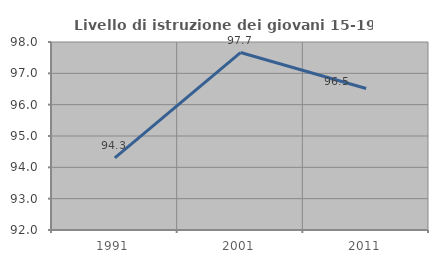
| Category | Livello di istruzione dei giovani 15-19 anni |
|---|---|
| 1991.0 | 94.302 |
| 2001.0 | 97.664 |
| 2011.0 | 96.517 |